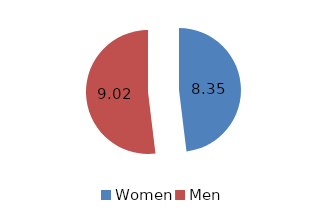
| Category | Series 0 |
|---|---|
| Women | 8.35 |
| Men | 9.02 |